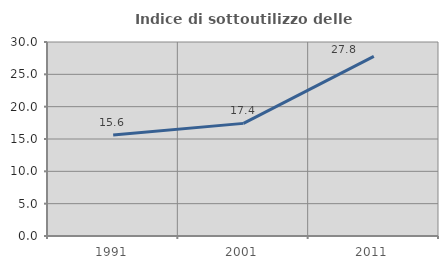
| Category | Indice di sottoutilizzo delle abitazioni  |
|---|---|
| 1991.0 | 15.616 |
| 2001.0 | 17.416 |
| 2011.0 | 27.769 |